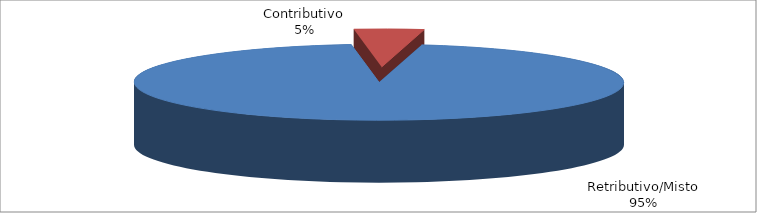
| Category | Series 1 |
|---|---|
| Retributivo/Misto | 115293 |
| Contributivo | 5549 |